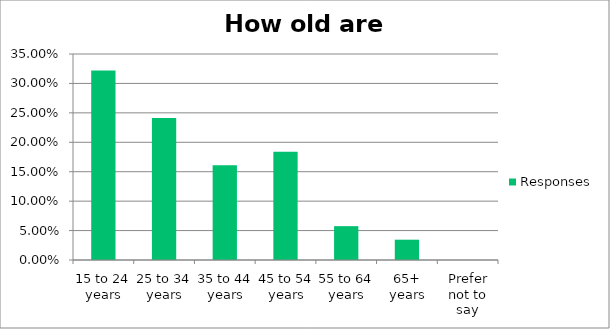
| Category | Responses |
|---|---|
| 15 to 24 years | 0.322 |
| 25 to 34 years | 0.241 |
| 35 to 44 years | 0.161 |
| 45 to 54 years | 0.184 |
| 55 to 64 years | 0.058 |
| 65+ years | 0.034 |
| Prefer not to say | 0 |